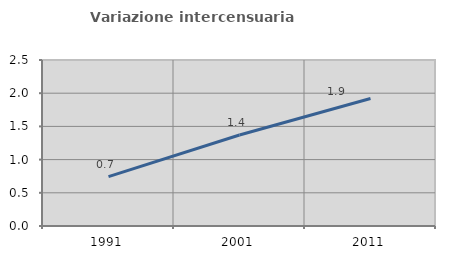
| Category | Variazione intercensuaria annua |
|---|---|
| 1991.0 | 0.745 |
| 2001.0 | 1.371 |
| 2011.0 | 1.921 |